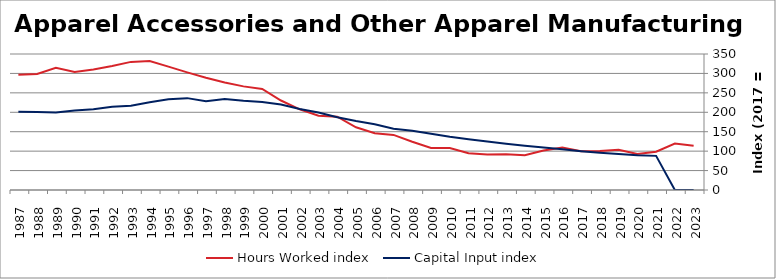
| Category | Hours Worked index | Capital Input index |
|---|---|---|
| 2023.0 | 113.661 | 0 |
| 2022.0 | 119.622 | 0 |
| 2021.0 | 98.524 | 87.837 |
| 2020.0 | 92.462 | 89.703 |
| 2019.0 | 103.277 | 92.657 |
| 2018.0 | 100.478 | 95.926 |
| 2017.0 | 100 | 100 |
| 2016.0 | 109.198 | 104.931 |
| 2015.0 | 101.472 | 109.35 |
| 2014.0 | 89.558 | 113.869 |
| 2013.0 | 92.18 | 118.872 |
| 2012.0 | 91.463 | 124.938 |
| 2011.0 | 94.519 | 130.821 |
| 2010.0 | 107.97 | 137.115 |
| 2009.0 | 108.05 | 144.905 |
| 2008.0 | 124.28 | 152.347 |
| 2007.0 | 141.755 | 157.853 |
| 2006.0 | 146.286 | 169.316 |
| 2005.0 | 161.35 | 177.578 |
| 2004.0 | 188.562 | 187.212 |
| 2003.0 | 191.325 | 199.339 |
| 2002.0 | 207.729 | 208.218 |
| 2001.0 | 230.318 | 220.276 |
| 2000.0 | 259.952 | 226.634 |
| 1999.0 | 266.647 | 229.62 |
| 1998.0 | 276.621 | 234.45 |
| 1997.0 | 288.745 | 228.713 |
| 1996.0 | 302.639 | 236.425 |
| 1995.0 | 317.506 | 233.377 |
| 1994.0 | 331.766 | 225.876 |
| 1993.0 | 329.709 | 216.878 |
| 1992.0 | 319.215 | 214.215 |
| 1991.0 | 309.999 | 208.044 |
| 1990.0 | 303.72 | 204.63 |
| 1989.0 | 314.298 | 199.513 |
| 1988.0 | 298.468 | 200.806 |
| 1987.0 | 296.791 | 201.336 |